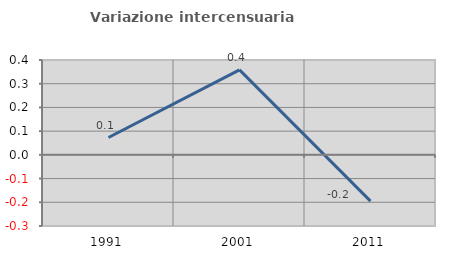
| Category | Variazione intercensuaria annua |
|---|---|
| 1991.0 | 0.073 |
| 2001.0 | 0.358 |
| 2011.0 | -0.195 |